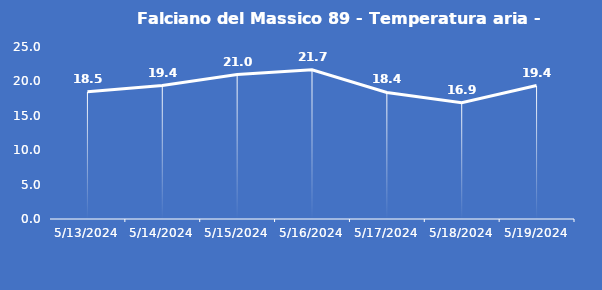
| Category | Falciano del Massico 89 - Temperatura aria - Grezzo (°C) |
|---|---|
| 5/13/24 | 18.5 |
| 5/14/24 | 19.4 |
| 5/15/24 | 21 |
| 5/16/24 | 21.7 |
| 5/17/24 | 18.4 |
| 5/18/24 | 16.9 |
| 5/19/24 | 19.4 |